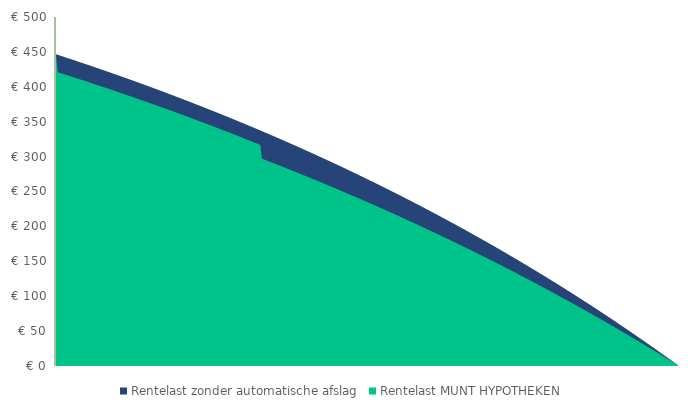
| Category | Rentelast zonder automatische afslag | Rentelast MUNT HYPOTHEKEN | -€ 200.000,00 |
|---|---|---|---|
| 0 | 446.667 | 446.667 |  |
| 1 | 445.857 | 420.903 |  |
| 2 | 445.046 | 420.117 |  |
| 3 | 444.233 | 419.33 |  |
| 4 | 443.418 | 418.542 |  |
| 5 | 442.602 | 417.751 |  |
| 6 | 441.783 | 416.959 |  |
| 7 | 440.963 | 416.166 |  |
| 8 | 440.141 | 415.37 |  |
| 9 | 439.317 | 414.573 |  |
| 10 | 438.491 | 413.774 |  |
| 11 | 437.663 | 412.974 |  |
| 12 | 436.834 | 412.172 |  |
| 13 | 436.002 | 411.368 |  |
| 14 | 435.169 | 410.563 |  |
| 15 | 434.334 | 409.756 |  |
| 16 | 433.497 | 408.947 |  |
| 17 | 432.658 | 408.136 |  |
| 18 | 431.818 | 407.324 |  |
| 19 | 430.975 | 406.51 |  |
| 20 | 430.131 | 405.694 |  |
| 21 | 429.284 | 404.877 |  |
| 22 | 428.436 | 404.058 |  |
| 23 | 427.586 | 403.237 |  |
| 24 | 426.734 | 402.414 |  |
| 25 | 425.88 | 401.59 |  |
| 26 | 425.024 | 400.764 |  |
| 27 | 424.166 | 399.936 |  |
| 28 | 423.307 | 399.107 |  |
| 29 | 422.445 | 398.275 |  |
| 30 | 421.582 | 397.442 |  |
| 31 | 420.716 | 396.607 |  |
| 32 | 419.849 | 395.771 |  |
| 33 | 418.98 | 394.932 |  |
| 34 | 418.108 | 394.092 |  |
| 35 | 417.235 | 393.25 |  |
| 36 | 416.36 | 392.407 |  |
| 37 | 415.483 | 391.561 |  |
| 38 | 414.604 | 390.714 |  |
| 39 | 413.723 | 389.865 |  |
| 40 | 412.84 | 389.014 |  |
| 41 | 411.955 | 388.162 |  |
| 42 | 411.068 | 387.307 |  |
| 43 | 410.179 | 386.451 |  |
| 44 | 409.288 | 385.593 |  |
| 45 | 408.395 | 384.733 |  |
| 46 | 407.5 | 383.872 |  |
| 47 | 406.604 | 383.008 |  |
| 48 | 405.705 | 382.143 |  |
| 49 | 404.804 | 381.276 |  |
| 50 | 403.901 | 380.407 |  |
| 51 | 402.996 | 379.536 |  |
| 52 | 402.089 | 378.664 |  |
| 53 | 401.18 | 377.789 |  |
| 54 | 400.269 | 376.913 |  |
| 55 | 399.356 | 376.035 |  |
| 56 | 398.441 | 375.155 |  |
| 57 | 397.524 | 374.273 |  |
| 58 | 396.605 | 373.39 |  |
| 59 | 395.684 | 372.504 |  |
| 60 | 394.76 | 371.617 |  |
| 61 | 393.835 | 370.728 |  |
| 62 | 392.908 | 369.836 |  |
| 63 | 391.978 | 368.943 |  |
| 64 | 391.047 | 368.048 |  |
| 65 | 390.113 | 367.152 |  |
| 66 | 389.177 | 366.253 |  |
| 67 | 388.239 | 365.352 |  |
| 68 | 387.3 | 364.45 |  |
| 69 | 386.358 | 363.546 |  |
| 70 | 385.413 | 362.639 |  |
| 71 | 384.467 | 361.731 |  |
| 72 | 383.519 | 360.821 |  |
| 73 | 382.568 | 359.909 |  |
| 74 | 381.616 | 358.995 |  |
| 75 | 380.661 | 358.079 |  |
| 76 | 379.704 | 357.161 |  |
| 77 | 378.745 | 356.242 |  |
| 78 | 377.784 | 355.32 |  |
| 79 | 376.821 | 354.396 |  |
| 80 | 375.856 | 353.471 |  |
| 81 | 374.888 | 352.543 |  |
| 82 | 373.919 | 351.614 |  |
| 83 | 372.947 | 350.682 |  |
| 84 | 371.973 | 349.749 |  |
| 85 | 370.996 | 348.814 |  |
| 86 | 370.018 | 347.876 |  |
| 87 | 369.037 | 346.937 |  |
| 88 | 368.055 | 345.996 |  |
| 89 | 367.07 | 345.052 |  |
| 90 | 366.082 | 344.107 |  |
| 91 | 365.093 | 343.16 |  |
| 92 | 364.102 | 342.211 |  |
| 93 | 363.108 | 341.259 |  |
| 94 | 362.112 | 340.306 |  |
| 95 | 361.113 | 339.351 |  |
| 96 | 360.113 | 338.393 |  |
| 97 | 359.11 | 337.434 |  |
| 98 | 358.105 | 336.473 |  |
| 99 | 357.098 | 335.509 |  |
| 100 | 356.089 | 334.544 |  |
| 101 | 355.077 | 333.577 |  |
| 102 | 354.063 | 332.607 |  |
| 103 | 353.047 | 331.636 |  |
| 104 | 352.028 | 330.662 |  |
| 105 | 351.008 | 329.686 |  |
| 106 | 349.985 | 328.709 |  |
| 107 | 348.959 | 327.729 |  |
| 108 | 347.932 | 326.747 |  |
| 109 | 346.902 | 325.763 |  |
| 110 | 345.869 | 324.778 |  |
| 111 | 344.835 | 323.789 |  |
| 112 | 343.798 | 322.799 |  |
| 113 | 342.759 | 321.807 |  |
| 114 | 341.718 | 320.813 |  |
| 115 | 340.674 | 319.817 |  |
| 116 | 339.628 | 318.818 |  |
| 117 | 338.579 | 317.817 |  |
| 118 | 337.528 | 316.815 |  |
| 119 | 336.475 | 297.086 |  |
| 120 | 335.42 | 296.123 |  |
| 121 | 334.362 | 295.159 |  |
| 122 | 333.302 | 294.192 |  |
| 123 | 332.239 | 293.224 |  |
| 124 | 331.174 | 292.254 |  |
| 125 | 330.107 | 291.281 |  |
| 126 | 329.037 | 290.307 |  |
| 127 | 327.965 | 289.331 |  |
| 128 | 326.89 | 288.353 |  |
| 129 | 325.814 | 287.373 |  |
| 130 | 324.734 | 286.391 |  |
| 131 | 323.653 | 285.407 |  |
| 132 | 322.568 | 284.421 |  |
| 133 | 321.482 | 283.433 |  |
| 134 | 320.393 | 282.443 |  |
| 135 | 319.301 | 281.452 |  |
| 136 | 318.208 | 280.458 |  |
| 137 | 317.111 | 279.462 |  |
| 138 | 316.013 | 278.465 |  |
| 139 | 314.911 | 277.465 |  |
| 140 | 313.808 | 276.464 |  |
| 141 | 312.702 | 275.46 |  |
| 142 | 311.593 | 274.454 |  |
| 143 | 310.482 | 273.447 |  |
| 144 | 309.368 | 272.437 |  |
| 145 | 308.252 | 271.426 |  |
| 146 | 307.134 | 270.412 |  |
| 147 | 306.013 | 269.396 |  |
| 148 | 304.889 | 268.379 |  |
| 149 | 303.763 | 267.359 |  |
| 150 | 302.635 | 266.338 |  |
| 151 | 301.504 | 265.314 |  |
| 152 | 300.37 | 264.288 |  |
| 153 | 299.234 | 263.26 |  |
| 154 | 298.095 | 262.231 |  |
| 155 | 296.954 | 261.199 |  |
| 156 | 295.81 | 260.165 |  |
| 157 | 294.664 | 259.129 |  |
| 158 | 293.515 | 258.091 |  |
| 159 | 292.364 | 257.051 |  |
| 160 | 291.21 | 256.009 |  |
| 161 | 290.053 | 254.965 |  |
| 162 | 288.894 | 253.919 |  |
| 163 | 287.732 | 252.87 |  |
| 164 | 286.568 | 251.82 |  |
| 165 | 285.401 | 250.767 |  |
| 166 | 284.231 | 249.713 |  |
| 167 | 283.059 | 248.656 |  |
| 168 | 281.884 | 247.597 |  |
| 169 | 280.707 | 246.537 |  |
| 170 | 279.527 | 245.474 |  |
| 171 | 278.344 | 244.409 |  |
| 172 | 277.159 | 243.341 |  |
| 173 | 275.971 | 242.272 |  |
| 174 | 274.78 | 241.201 |  |
| 175 | 273.587 | 240.127 |  |
| 176 | 272.391 | 239.052 |  |
| 177 | 271.192 | 237.974 |  |
| 178 | 269.991 | 236.894 |  |
| 179 | 268.787 | 235.812 |  |
| 180 | 267.58 | 234.727 |  |
| 181 | 266.371 | 233.641 |  |
| 182 | 265.159 | 232.553 |  |
| 183 | 263.944 | 231.462 |  |
| 184 | 262.727 | 230.369 |  |
| 185 | 261.506 | 229.274 |  |
| 186 | 260.284 | 228.177 |  |
| 187 | 259.058 | 227.078 |  |
| 188 | 257.829 | 225.976 |  |
| 189 | 256.598 | 224.872 |  |
| 190 | 255.364 | 223.766 |  |
| 191 | 254.128 | 222.658 |  |
| 192 | 252.888 | 221.548 |  |
| 193 | 251.646 | 220.435 |  |
| 194 | 250.401 | 219.321 |  |
| 195 | 249.154 | 218.204 |  |
| 196 | 247.903 | 217.085 |  |
| 197 | 246.65 | 215.963 |  |
| 198 | 245.394 | 214.84 |  |
| 199 | 244.135 | 213.714 |  |
| 200 | 242.873 | 212.586 |  |
| 201 | 241.608 | 211.456 |  |
| 202 | 240.341 | 210.323 |  |
| 203 | 239.071 | 209.188 |  |
| 204 | 237.798 | 208.051 |  |
| 205 | 236.522 | 206.912 |  |
| 206 | 235.243 | 205.77 |  |
| 207 | 233.962 | 204.627 |  |
| 208 | 232.677 | 203.481 |  |
| 209 | 231.39 | 202.332 |  |
| 210 | 230.1 | 201.182 |  |
| 211 | 228.807 | 200.029 |  |
| 212 | 227.511 | 198.873 |  |
| 213 | 226.212 | 197.716 |  |
| 214 | 224.91 | 196.556 |  |
| 215 | 223.605 | 195.394 |  |
| 216 | 222.298 | 194.23 |  |
| 217 | 220.987 | 193.063 |  |
| 218 | 219.674 | 191.894 |  |
| 219 | 218.358 | 190.723 |  |
| 220 | 217.038 | 189.549 |  |
| 221 | 215.716 | 188.373 |  |
| 222 | 214.391 | 187.195 |  |
| 223 | 213.063 | 186.014 |  |
| 224 | 211.732 | 184.831 |  |
| 225 | 210.397 | 183.646 |  |
| 226 | 209.06 | 182.458 |  |
| 227 | 207.72 | 181.268 |  |
| 228 | 206.377 | 180.076 |  |
| 229 | 205.031 | 178.881 |  |
| 230 | 203.682 | 177.684 |  |
| 231 | 202.33 | 176.484 |  |
| 232 | 200.975 | 175.282 |  |
| 233 | 199.617 | 174.078 |  |
| 234 | 198.256 | 172.872 |  |
| 235 | 196.892 | 171.662 |  |
| 236 | 195.524 | 170.451 |  |
| 237 | 194.154 | 169.237 |  |
| 238 | 192.781 | 168.021 |  |
| 239 | 191.404 | 166.802 |  |
| 240 | 190.025 | 165.581 |  |
| 241 | 188.642 | 164.358 |  |
| 242 | 187.257 | 163.132 |  |
| 243 | 185.868 | 161.903 |  |
| 244 | 184.476 | 160.673 |  |
| 245 | 183.081 | 159.439 |  |
| 246 | 181.683 | 158.204 |  |
| 247 | 180.282 | 156.965 |  |
| 248 | 178.877 | 155.725 |  |
| 249 | 177.47 | 154.482 |  |
| 250 | 176.059 | 153.236 |  |
| 251 | 174.646 | 151.988 |  |
| 252 | 173.229 | 150.738 |  |
| 253 | 171.809 | 149.485 |  |
| 254 | 170.385 | 148.229 |  |
| 255 | 168.959 | 146.971 |  |
| 256 | 167.529 | 145.711 |  |
| 257 | 166.096 | 144.448 |  |
| 258 | 164.66 | 143.183 |  |
| 259 | 163.221 | 141.915 |  |
| 260 | 161.779 | 140.644 |  |
| 261 | 160.333 | 139.371 |  |
| 262 | 158.884 | 138.096 |  |
| 263 | 157.432 | 136.818 |  |
| 264 | 155.977 | 135.537 |  |
| 265 | 154.518 | 134.254 |  |
| 266 | 153.056 | 132.969 |  |
| 267 | 151.591 | 131.68 |  |
| 268 | 150.123 | 130.39 |  |
| 269 | 148.651 | 129.096 |  |
| 270 | 147.176 | 127.8 |  |
| 271 | 145.698 | 126.502 |  |
| 272 | 144.216 | 125.201 |  |
| 273 | 142.731 | 123.897 |  |
| 274 | 141.243 | 122.591 |  |
| 275 | 139.752 | 121.282 |  |
| 276 | 138.257 | 119.971 |  |
| 277 | 136.759 | 118.657 |  |
| 278 | 135.257 | 117.341 |  |
| 279 | 133.752 | 116.021 |  |
| 280 | 132.244 | 114.7 |  |
| 281 | 130.732 | 113.375 |  |
| 282 | 129.217 | 112.048 |  |
| 283 | 127.699 | 110.718 |  |
| 284 | 126.177 | 109.386 |  |
| 285 | 124.652 | 108.051 |  |
| 286 | 123.124 | 106.713 |  |
| 287 | 121.592 | 105.373 |  |
| 288 | 120.056 | 104.03 |  |
| 289 | 118.517 | 102.685 |  |
| 290 | 116.975 | 101.336 |  |
| 291 | 115.429 | 99.986 |  |
| 292 | 113.88 | 98.632 |  |
| 293 | 112.328 | 97.276 |  |
| 294 | 110.771 | 95.917 |  |
| 295 | 109.212 | 94.555 |  |
| 296 | 107.649 | 93.191 |  |
| 297 | 106.082 | 91.823 |  |
| 298 | 104.512 | 90.454 |  |
| 299 | 102.939 | 89.081 |  |
| 300 | 101.362 | 87.706 |  |
| 301 | 99.781 | 86.328 |  |
| 302 | 98.197 | 84.947 |  |
| 303 | 96.609 | 83.564 |  |
| 304 | 95.018 | 82.178 |  |
| 305 | 93.423 | 80.789 |  |
| 306 | 91.825 | 79.397 |  |
| 307 | 90.223 | 78.003 |  |
| 308 | 88.618 | 76.605 |  |
| 309 | 87.009 | 75.205 |  |
| 310 | 85.396 | 73.803 |  |
| 311 | 83.78 | 72.397 |  |
| 312 | 82.16 | 70.989 |  |
| 313 | 80.536 | 69.578 |  |
| 314 | 78.909 | 68.164 |  |
| 315 | 77.279 | 66.747 |  |
| 316 | 75.644 | 65.328 |  |
| 317 | 74.006 | 63.905 |  |
| 318 | 72.365 | 62.48 |  |
| 319 | 70.719 | 61.052 |  |
| 320 | 69.07 | 59.621 |  |
| 321 | 67.418 | 58.188 |  |
| 322 | 65.761 | 56.751 |  |
| 323 | 64.101 | 55.312 |  |
| 324 | 62.437 | 53.869 |  |
| 325 | 60.77 | 52.424 |  |
| 326 | 59.098 | 50.976 |  |
| 327 | 57.424 | 49.526 |  |
| 328 | 55.745 | 48.072 |  |
| 329 | 54.062 | 46.615 |  |
| 330 | 52.376 | 45.156 |  |
| 331 | 50.686 | 43.694 |  |
| 332 | 48.992 | 42.228 |  |
| 333 | 47.295 | 40.76 |  |
| 334 | 45.593 | 39.289 |  |
| 335 | 43.888 | 37.815 |  |
| 336 | 42.179 | 36.338 |  |
| 337 | 40.467 | 34.858 |  |
| 338 | 38.75 | 33.376 |  |
| 339 | 37.03 | 31.89 |  |
| 340 | 35.305 | 30.401 |  |
| 341 | 33.577 | 28.91 |  |
| 342 | 31.845 | 27.415 |  |
| 343 | 30.109 | 25.917 |  |
| 344 | 28.37 | 24.417 |  |
| 345 | 26.626 | 22.913 |  |
| 346 | 24.879 | 21.407 |  |
| 347 | 23.127 | 19.898 |  |
| 348 | 21.372 | 18.385 |  |
| 349 | 19.613 | 16.87 |  |
| 350 | 17.85 | 15.351 |  |
| 351 | 16.083 | 13.83 |  |
| 352 | 14.311 | 12.305 |  |
| 353 | 12.536 | 10.778 |  |
| 354 | 10.758 | 9.247 |  |
| 355 | 8.975 | 7.714 |  |
| 356 | 7.188 | 6.177 |  |
| 357 | 5.397 | 4.637 |  |
| 358 | 3.602 | 3.095 |  |
| 359 | 1.803 | 1.549 |  |
| 360 | 0 | 0 |  |